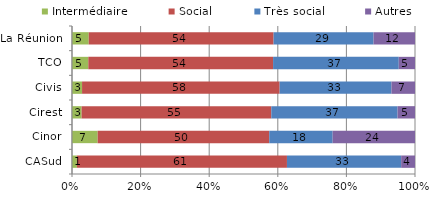
| Category | Intermédiaire | Social | Très social | Autres |
|---|---|---|---|---|
| CASud | 1.439 | 61.231 | 33.295 | 4.036 |
| Cinor | 7.486 | 50.019 | 18.49 | 24.005 |
| Cirest | 2.796 | 55.308 | 36.812 | 5.084 |
| Civis | 2.934 | 57.603 | 32.606 | 6.857 |
| TCO | 4.751 | 53.873 | 36.642 | 4.734 |
| La Réunion | 4.878 | 53.893 | 29.142 | 12.087 |